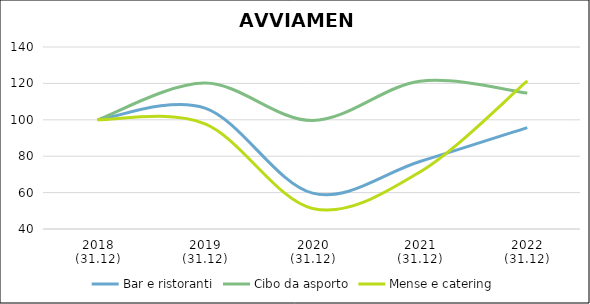
| Category | Bar e ristoranti | Cibo da asporto | Mense e catering |
|---|---|---|---|
| 2018
(31.12) | 100 | 100 | 100 |
| 2019
(31.12) | 106.404 | 120.155 | 97.773 |
| 2020
(31.12) | 59.719 | 99.612 | 51.306 |
| 2021
(31.12) | 77.085 | 121.189 | 71.349 |
| 2022
(31.12) | 95.722 | 114.729 | 121.37 |